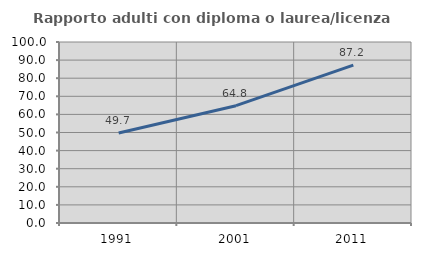
| Category | Rapporto adulti con diploma o laurea/licenza media  |
|---|---|
| 1991.0 | 49.718 |
| 2001.0 | 64.821 |
| 2011.0 | 87.212 |